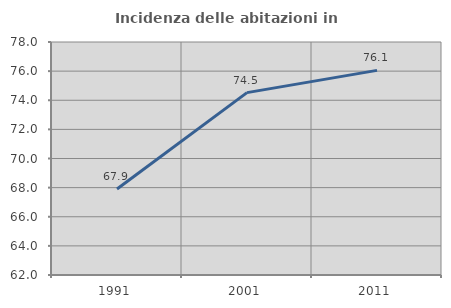
| Category | Incidenza delle abitazioni in proprietà  |
|---|---|
| 1991.0 | 67.904 |
| 2001.0 | 74.523 |
| 2011.0 | 76.052 |